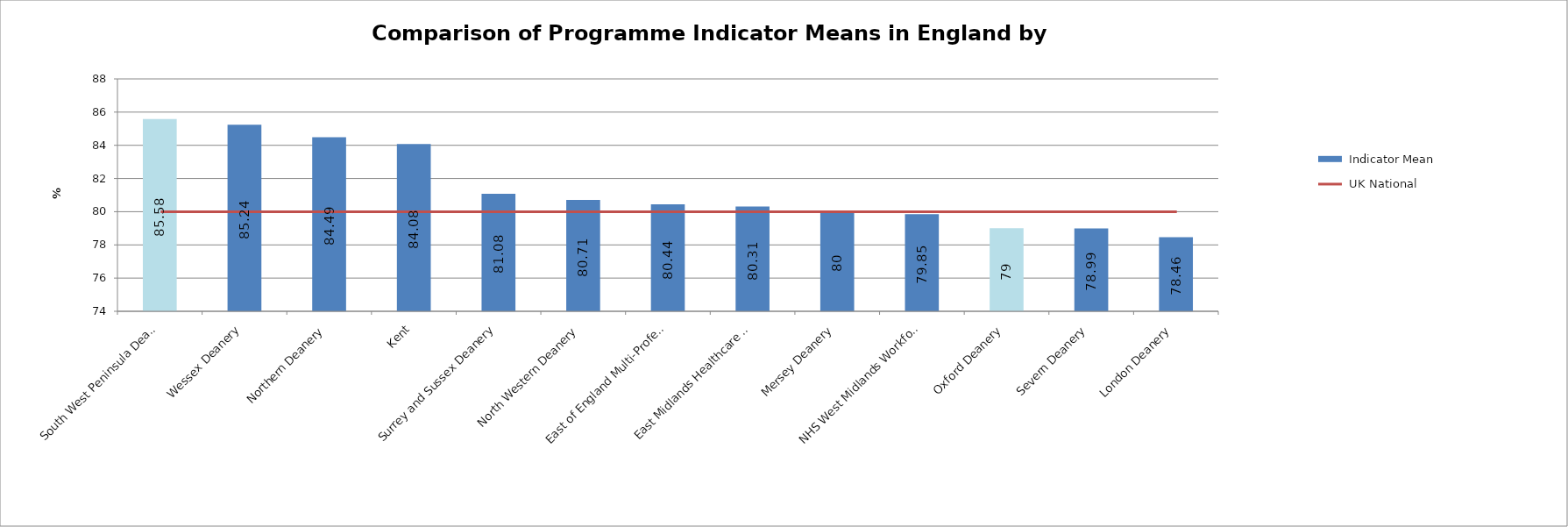
| Category |  Indicator Mean |
|---|---|
| South West Peninsula Deanery | 85.58 |
| Wessex Deanery | 85.24 |
| Northern Deanery | 84.49 |
| Kent, Surrey and Sussex Deanery | 84.08 |
| North Western Deanery | 81.08 |
| East of England Multi-Professional Deanery | 80.71 |
| East Midlands Healthcare Workforce Deanery | 80.44 |
| Mersey Deanery | 80.31 |
| NHS West Midlands Workforce Deanery | 80 |
| Oxford Deanery | 79.85 |
| Severn Deanery | 79 |
| London Deanery | 78.99 |
| Yorkshire and the Humber Postgraduate Deanery | 78.46 |